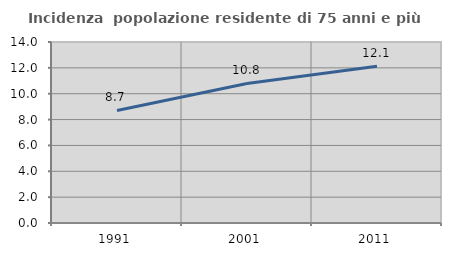
| Category | Incidenza  popolazione residente di 75 anni e più |
|---|---|
| 1991.0 | 8.706 |
| 2001.0 | 10.793 |
| 2011.0 | 12.122 |